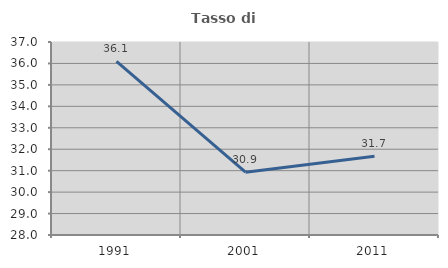
| Category | Tasso di occupazione   |
|---|---|
| 1991.0 | 36.1 |
| 2001.0 | 30.93 |
| 2011.0 | 31.671 |